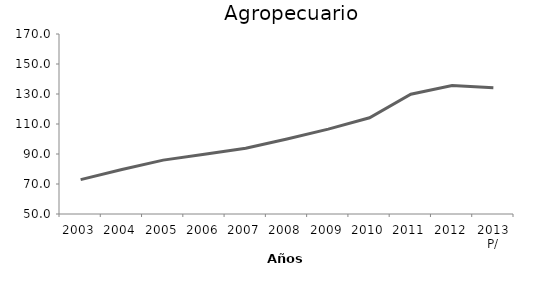
| Category | Agricultura, cría y explotación de animales, aprovechamiento forestal, pesca y caza |
|---|---|
| 2003 | 72.899 |
| 2004 | 79.658 |
| 2005 | 85.914 |
| 2006 | 89.796 |
| 2007 | 93.862 |
| 2008 | 100 |
| 2009 | 106.578 |
| 2010 | 114.179 |
| 2011 | 129.877 |
| 2012 | 135.645 |
| 2013 P/ | 134.139 |